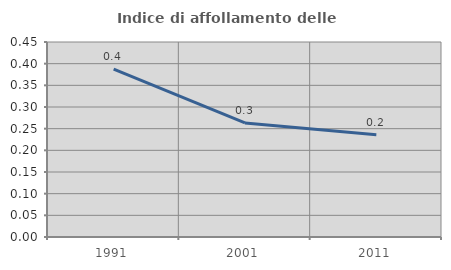
| Category | Indice di affollamento delle abitazioni  |
|---|---|
| 1991.0 | 0.388 |
| 2001.0 | 0.263 |
| 2011.0 | 0.236 |